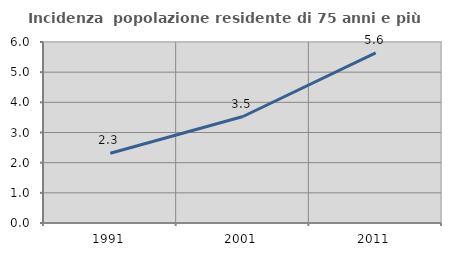
| Category | Incidenza  popolazione residente di 75 anni e più |
|---|---|
| 1991.0 | 2.314 |
| 2001.0 | 3.53 |
| 2011.0 | 5.638 |